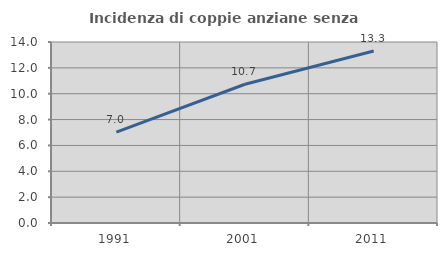
| Category | Incidenza di coppie anziane senza figli  |
|---|---|
| 1991.0 | 7.035 |
| 2001.0 | 10.731 |
| 2011.0 | 13.305 |